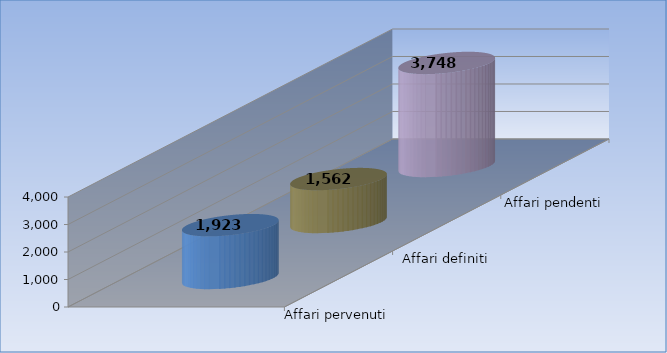
| Category | Affari pervenuti | Affari definiti | Affari pendenti |
|---|---|---|---|
| 0 | 1923 | 1562 | 3748 |